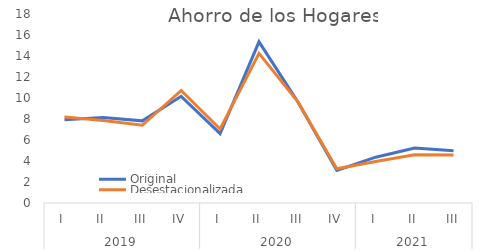
| Category | Original | Desestacionalizada |
|---|---|---|
| 0 | 7.922 | 8.185 |
| 1 | 8.145 | 7.854 |
| 2 | 7.823 | 7.405 |
| 3 | 10.157 | 10.719 |
| 4 | 6.612 | 7.051 |
| 5 | 15.351 | 14.245 |
| 6 | 9.619 | 9.627 |
| 7 | 3.095 | 3.258 |
| 8 | 4.364 | 3.95 |
| 9 | 5.24 | 4.605 |
| 10 | 4.978 | 4.565 |